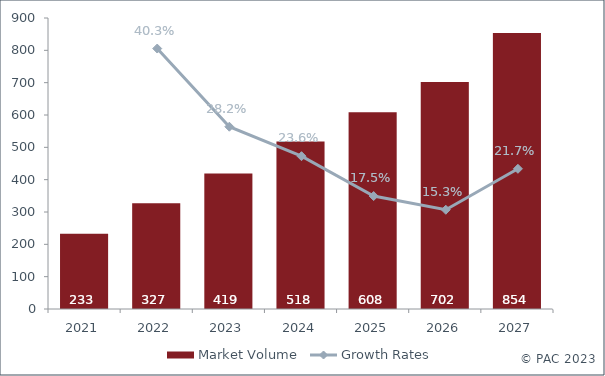
| Category | Market Volume |
|---|---|
| 2021.0 | 232.966 |
| 2022.0 | 326.798 |
| 2023.0 | 418.915 |
| 2024.0 | 517.915 |
| 2025.0 | 608.375 |
| 2026.0 | 701.737 |
| 2027.0 | 853.865 |